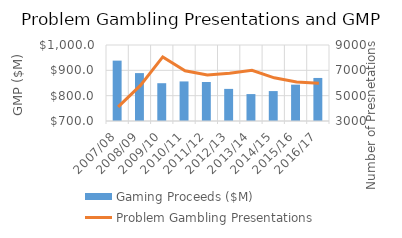
| Category | Gaming Proceeds ($M) |
|---|---|
| 2007/08 | 938.305 |
| 2008/09 | 889.099 |
| 2009/10 | 849.163 |
| 2010/11 | 856.194 |
| 2011/12 | 853.963 |
| 2012/13 | 826.743 |
| 2013/14 | 806.271 |
| 2014/15 | 818.113 |
| 2015/16 | 843.482 |